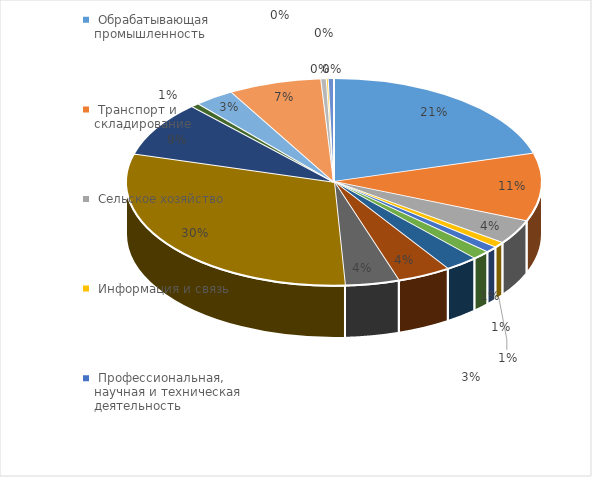
| Category | Series 0 | Series 1 | Series 2 |
|---|---|---|---|
|  Обрабатывающая промышленность  | 0.206 | 0 | 0.206 |
|  Транспорт и складирование  | 0.106 | 0 | 0.106 |
|  Сельское хозяйство  | 0.038 | 0 | 0.038 |
|  Информация и связь  | 0.009 | 0 | 0.009 |
|  Профессиональная, научная и техническая деятельность  | 0.009 | 0 | 0.009 |
|  Услуги в области образования  | 0.014 | 0 | 0.014 |
|  Медицинские услуги  | 0.026 | 0 | 0.026 |
|  Услуги по проживанию  | 0.042 | 0 | 0.042 |
|  Прочие услуги  | 0.042 | 0 | 0.042 |
| Оптовая и розничная торговля | 0.302 | 0 | 0.302 |
| Строительство | 0.086 | 0 | 0.086 |
| Искусство, развлечения и отдых | 0.006 | 0 | 0.006 |
| Деятельность в области административного и вспомогательного обслуживания | 0.031 | 0 | 0.031 |
| Операции с недвижимым имуществом | 0.072 | 0 | 0.072 |
| Водоснабжение; сбор, обработка и удаление отходов | 0.004 | 0 | 0.004 |
| D-Снабжение электроэнергией, газом, паром, горячей водой и  кондиционированным воздухом | 0.001 | 0 | 0.001 |
| K-Финансовая и страховая деятельность | 0.004 | 0 | 0.004 |
| T-Деятельность домашних хозяйств, нанимающих домашнюю прислугу и производящих товары и услуги для собственного потребления | 0 | 0 | 0 |